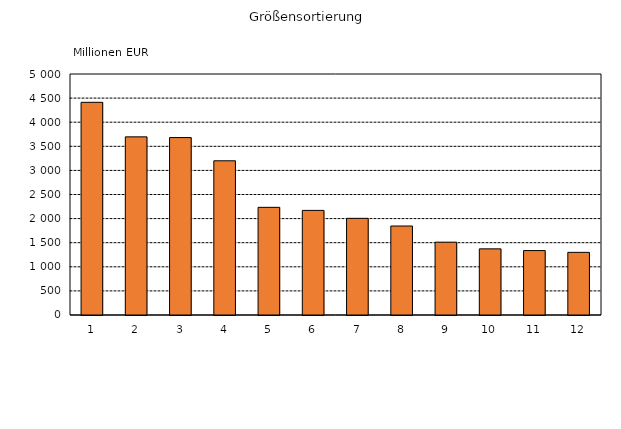
| Category | Series 0 |
|---|---|
| 0 | 4412.513 |
| 1 | 3695.558 |
| 2 | 3681.335 |
| 3 | 3199.353 |
| 4 | 2233.688 |
| 5 | 2170.076 |
| 6 | 2005.62 |
| 7 | 1846.215 |
| 8 | 1510.725 |
| 9 | 1372.04 |
| 10 | 1336.78 |
| 11 | 1299.895 |